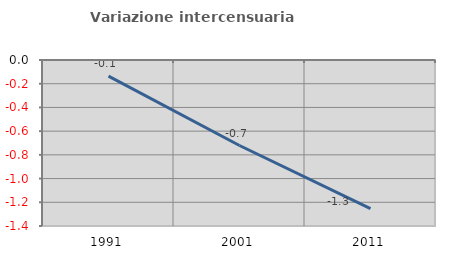
| Category | Variazione intercensuaria annua |
|---|---|
| 1991.0 | -0.136 |
| 2001.0 | -0.721 |
| 2011.0 | -1.253 |